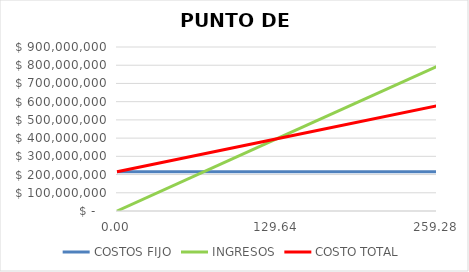
| Category | COSTOS FIJO | INGRESOS | COSTO TOTAL |
|---|---|---|---|
| 0.0 | 215722000 | 0 | 215722000 |
| 129.6421019652521 | 215722000 | 396790850.47 | 396790850.47 |
| 259.2842039305042 | 215722000 | 793581700.94 | 577859700.94 |